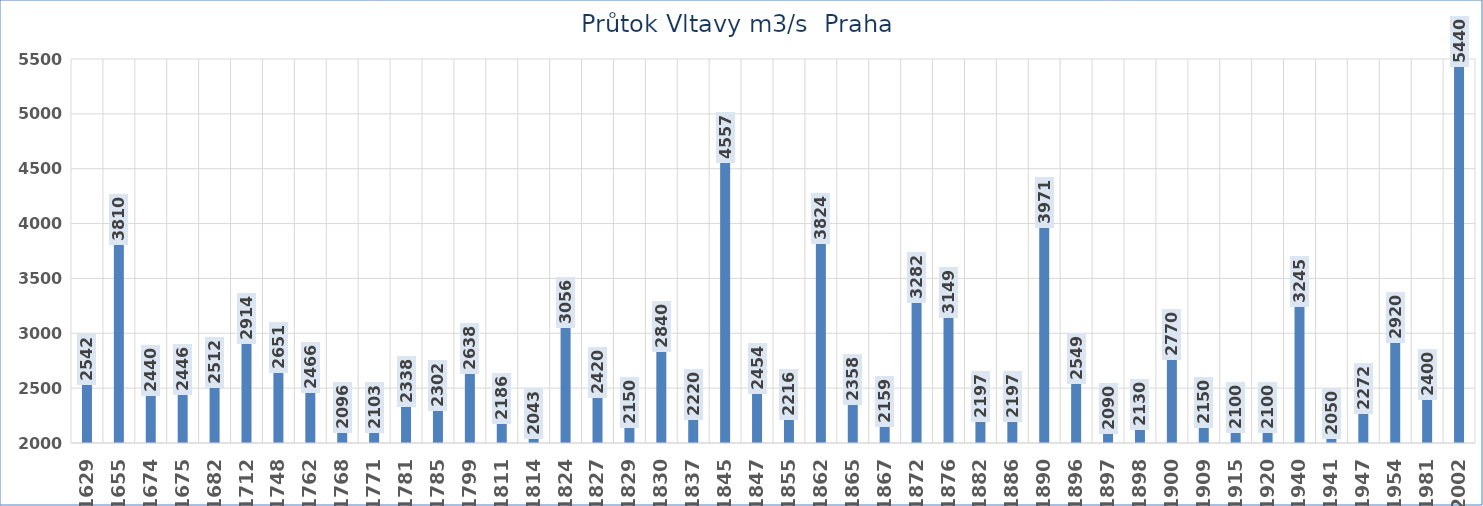
| Category | m3/s  Praha |
|---|---|
|  1629 | 2542 |
|  1655 | 3810 |
|  1674 | 2440 |
|  1675 | 2446 |
|  1682 | 2512 |
|  1712 | 2914 |
|  1748 | 2651 |
|  1762 | 2466 |
|  1768 | 2096 |
|  1771 | 2103 |
|  1781 | 2338 |
|  1785 | 2302 |
|  1799 | 2638 |
|  1811 | 2186 |
|  1814 | 2043 |
|  1824 | 3056 |
|  1827 | 2420 |
|  1829 | 2150 |
|  1830 | 2840 |
|  1837 | 2220 |
|  1845 | 4557 |
|  1847 | 2454 |
|  1855 | 2216 |
|  1862 | 3824 |
|  1865 | 2358 |
|  1867 | 2159 |
|  1872 | 3282 |
|  1876 | 3149 |
|  1882 | 2197 |
|  1886 | 2197 |
|  1890 | 3971 |
|  1896 | 2549 |
|  1897 | 2090 |
|  1898 | 2130 |
|  1900 | 2770 |
|  1909 | 2150 |
|  1915 | 2100 |
|  1920 | 2100 |
|  1940 | 3245 |
|  1941 | 2050 |
|  1947 | 2272 |
|  1954 | 2920 |
|  1981 | 2400 |
|  2002 | 5440 |